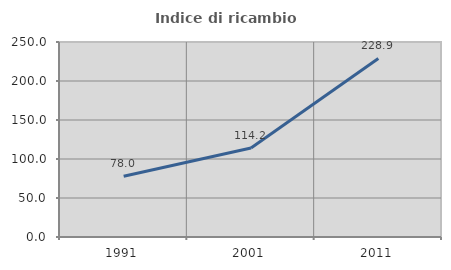
| Category | Indice di ricambio occupazionale  |
|---|---|
| 1991.0 | 77.963 |
| 2001.0 | 114.172 |
| 2011.0 | 228.86 |